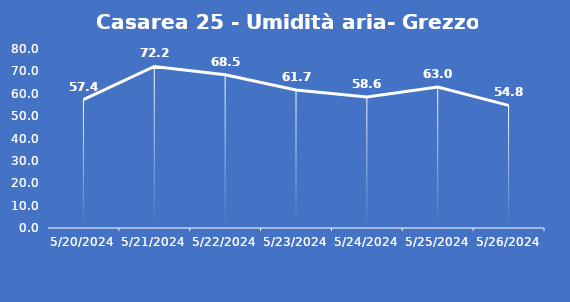
| Category | Casarea 25 - Umidità aria- Grezzo (%) |
|---|---|
| 5/20/24 | 57.4 |
| 5/21/24 | 72.2 |
| 5/22/24 | 68.5 |
| 5/23/24 | 61.7 |
| 5/24/24 | 58.6 |
| 5/25/24 | 63 |
| 5/26/24 | 54.8 |